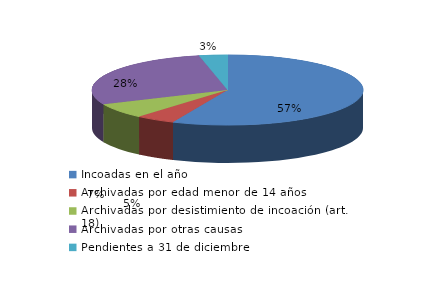
| Category | Series 0 |
|---|---|
| Incoadas en el año | 2014 |
| Archivadas por edad menor de 14 años | 168 |
| Archivadas por desistimiento de incoación (art. 18) | 251 |
| Archivadas por otras causas | 1007 |
| Pendientes a 31 de diciembre | 120 |